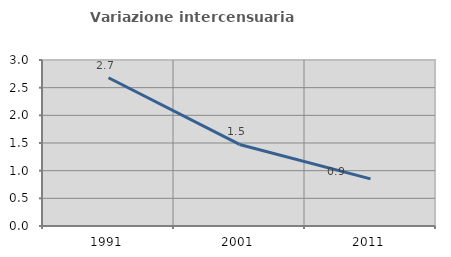
| Category | Variazione intercensuaria annua |
|---|---|
| 1991.0 | 2.679 |
| 2001.0 | 1.474 |
| 2011.0 | 0.853 |